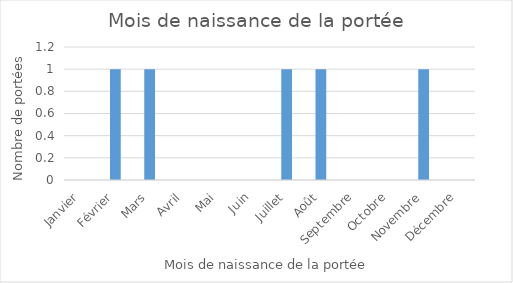
| Category | Series 0 |
|---|---|
| Janvier | 0 |
| Février | 1 |
| Mars | 1 |
| Avril | 0 |
| Mai | 0 |
| Juin | 0 |
| Juillet | 1 |
| Août | 1 |
| Septembre | 0 |
| Octobre | 0 |
| Novembre | 1 |
| Décembre | 0 |